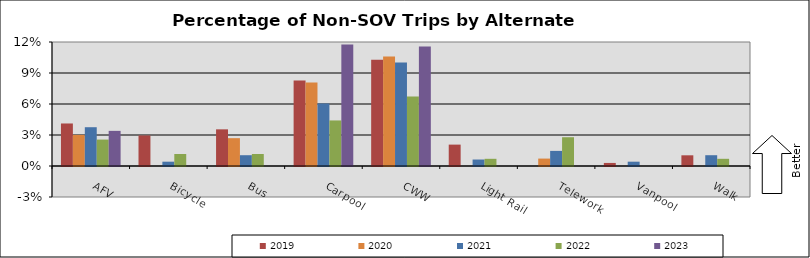
| Category | 2019 | 2020 | 2021 | 2022 | 2023 |
|---|---|---|---|---|---|
| AFV | 0.041 | 0.03 | 0.038 | 0.026 | 0.034 |
| Bicycle | 0.03 | 0 | 0.004 | 0.012 | 0 |
| Bus | 0.035 | 0.027 | 0.01 | 0.012 | 0 |
| Carpool | 0.083 | 0.081 | 0.061 | 0.044 | 0.118 |
| CWW | 0.103 | 0.106 | 0.1 | 0.067 | 0.116 |
| Light Rail | 0.021 | 0 | 0.006 | 0.007 | 0 |
| Telework | 0 | 0.007 | 0.015 | 0.028 | 0 |
| Vanpool | 0.003 | 0 | 0.004 | 0 | 0 |
| Walk | 0.01 | 0 | 0.01 | 0.007 | 0 |